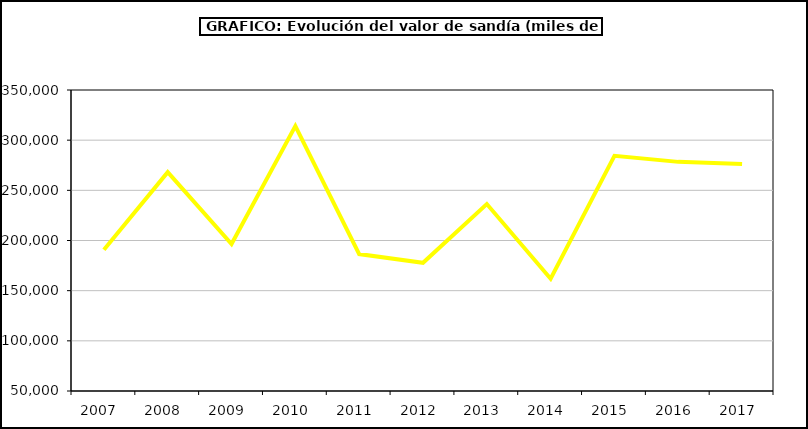
| Category | Valor |
|---|---|
| 2007.0 | 190776.416 |
| 2008.0 | 268149.211 |
| 2009.0 | 196465.666 |
| 2010.0 | 314067.402 |
| 2011.0 | 186441.033 |
| 2012.0 | 177750.096 |
| 2013.0 | 236329.828 |
| 2014.0 | 161950.328 |
| 2015.0 | 284357 |
| 2016.0 | 278370 |
| 2017.0 | 276294.254 |